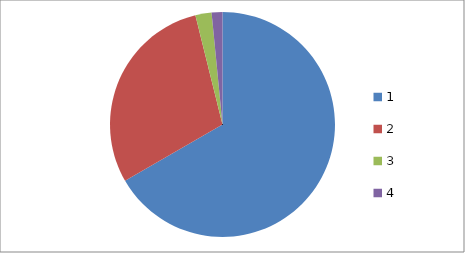
| Category | Series 0 |
|---|---|
| 0 | 86 |
| 1 | 38 |
| 2 | 3 |
| 3 | 2 |